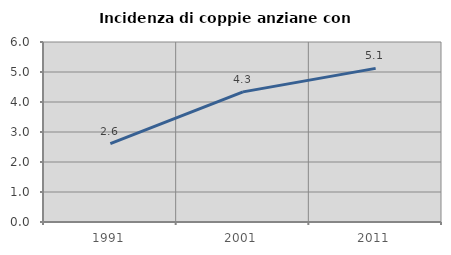
| Category | Incidenza di coppie anziane con figli |
|---|---|
| 1991.0 | 2.612 |
| 2001.0 | 4.337 |
| 2011.0 | 5.121 |